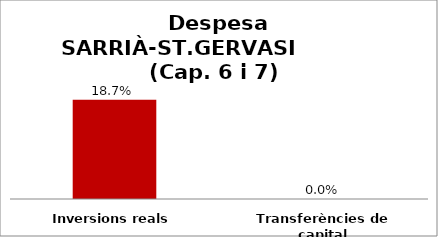
| Category | Series 0 |
|---|---|
| Inversions reals | 0.187 |
| Transferències de capital | 0 |